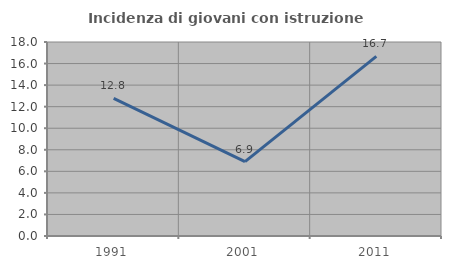
| Category | Incidenza di giovani con istruzione universitaria |
|---|---|
| 1991.0 | 12.766 |
| 2001.0 | 6.897 |
| 2011.0 | 16.667 |